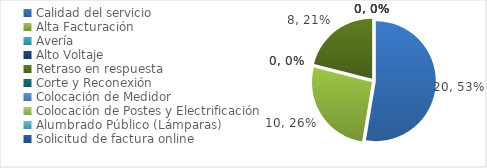
| Category | Series 0 |
|---|---|
| Calidad del servicio | 20 |
| Alta Facturación | 10 |
| Avería | 0 |
| Alto Voltaje | 0 |
| Retraso en respuesta | 8 |
| Corte y Reconexión  | 0 |
| Colocación de Medidor | 0 |
| Colocación de Postes y Electrificación  | 0 |
| Alumbrado Público (Lámparas) | 0 |
| Solicitud de factura online | 0 |